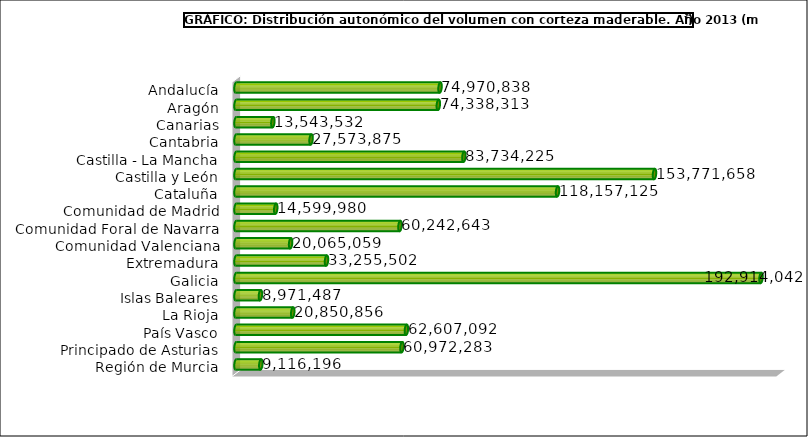
| Category | Series 0 |
|---|---|
| Andalucía | 74970838 |
| Aragón | 74338313 |
| Canarias | 13543532 |
| Cantabria | 27573875 |
| Castilla - La Mancha | 83734225 |
| Castilla y León | 153771658 |
| Cataluña | 118157125 |
| Comunidad de Madrid | 14599980 |
| Comunidad Foral de Navarra | 60242643 |
| Comunidad Valenciana | 20065059 |
| Extremadura | 33255502 |
| Galicia | 192914042 |
| Islas Baleares | 8971487 |
| La Rioja | 20850856 |
| País Vasco | 62607092 |
| Principado de Asturias | 60972283 |
| Región de Murcia | 9116196 |